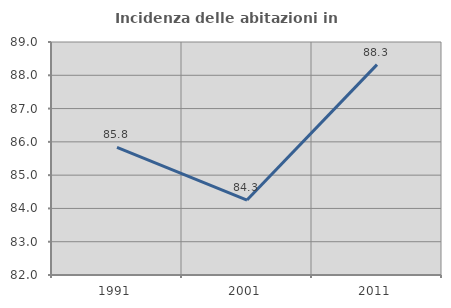
| Category | Incidenza delle abitazioni in proprietà  |
|---|---|
| 1991.0 | 85.833 |
| 2001.0 | 84.252 |
| 2011.0 | 88.321 |